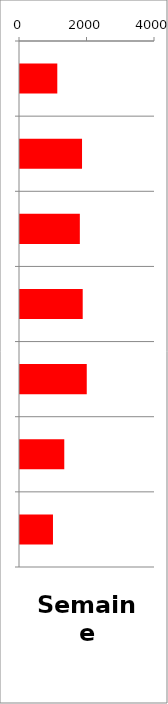
| Category | VL |
|---|---|
| 0 | 1105 |
| 1 | 1838 |
| 2 | 1773 |
| 3 | 1858 |
| 4 | 1978 |
| 5 | 1312 |
| 6 | 977 |